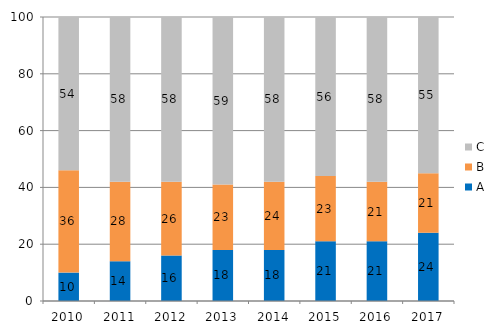
| Category | A | B | C |
|---|---|---|---|
| 2010.0 | 10 | 36 | 54 |
| 2011.0 | 14 | 28 | 58 |
| 2012.0 | 16 | 26 | 58 |
| 2013.0 | 18 | 23 | 59 |
| 2014.0 | 18 | 24 | 58 |
| 2015.0 | 21 | 23 | 56 |
| 2016.0 | 21 | 21 | 58 |
| 2017.0 | 24 | 21 | 55 |